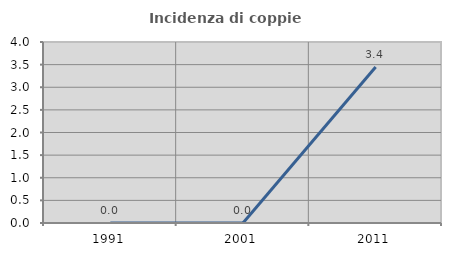
| Category | Incidenza di coppie miste |
|---|---|
| 1991.0 | 0 |
| 2001.0 | 0 |
| 2011.0 | 3.448 |